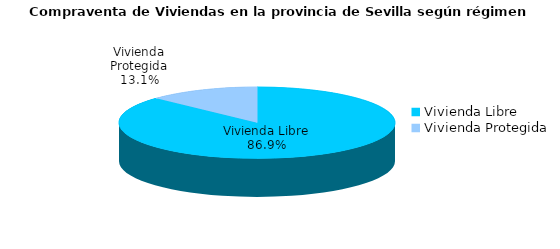
| Category | Series 0 | Series 1 |
|---|---|---|
| Vivienda Libre | 806 | 0.869 |
| Vivienda Protegida | 121 | 0.131 |